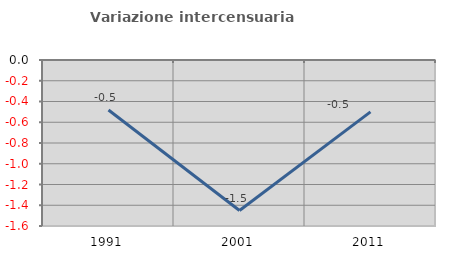
| Category | Variazione intercensuaria annua |
|---|---|
| 1991.0 | -0.482 |
| 2001.0 | -1.451 |
| 2011.0 | -0.5 |